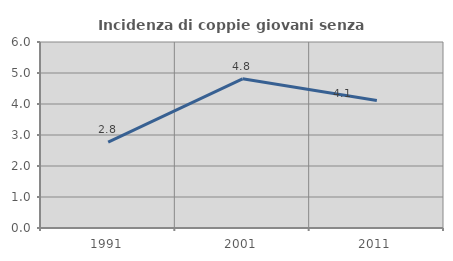
| Category | Incidenza di coppie giovani senza figli |
|---|---|
| 1991.0 | 2.769 |
| 2001.0 | 4.812 |
| 2011.0 | 4.113 |